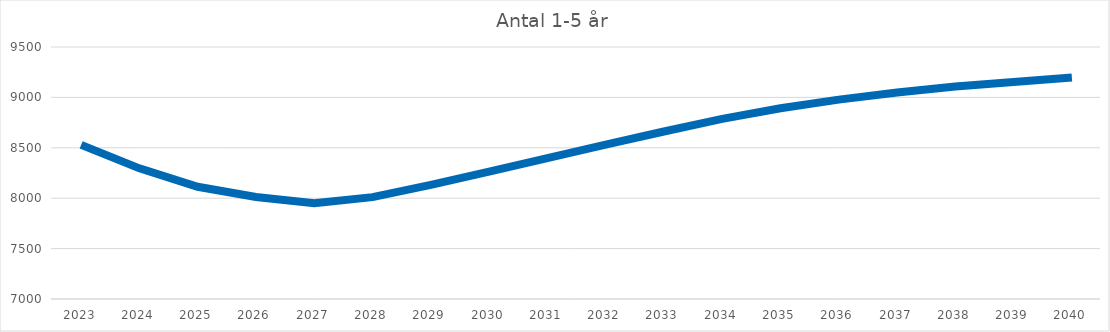
| Category | Antal 1-5 år |
|---|---|
| 2023.0 | 8529 |
| 2024.0 | 8296.12 |
| 2025.0 | 8113.251 |
| 2026.0 | 8012.363 |
| 2027.0 | 7949.677 |
| 2028.0 | 8010.679 |
| 2029.0 | 8131.641 |
| 2030.0 | 8264.534 |
| 2031.0 | 8398.238 |
| 2032.0 | 8531.066 |
| 2033.0 | 8661.953 |
| 2034.0 | 8786.412 |
| 2035.0 | 8891.984 |
| 2036.0 | 8977.801 |
| 2037.0 | 9049.486 |
| 2038.0 | 9107.39 |
| 2039.0 | 9153.497 |
| 2040.0 | 9197.108 |